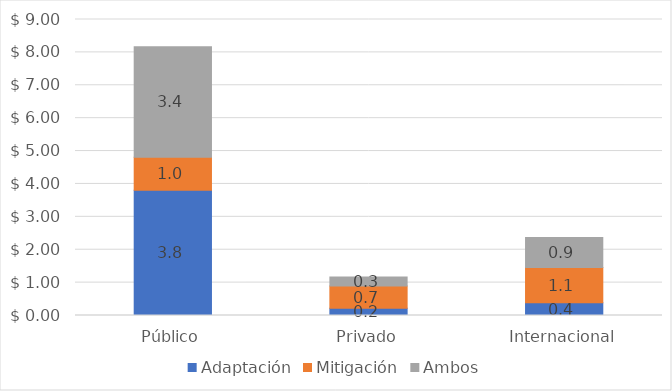
| Category | Adaptación | Mitigación | Ambos |
|---|---|---|---|
| Público | 3.811 | 1.003 | 3.358 |
| Privado | 0.224 | 0.672 | 0.275 |
| Internacional | 0.387 | 1.075 | 0.906 |